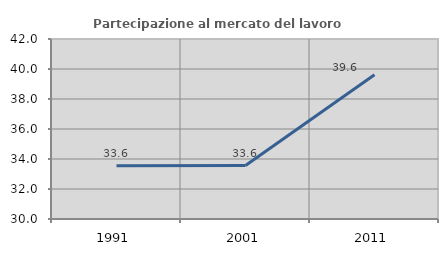
| Category | Partecipazione al mercato del lavoro  femminile |
|---|---|
| 1991.0 | 33.556 |
| 2001.0 | 33.562 |
| 2011.0 | 39.623 |